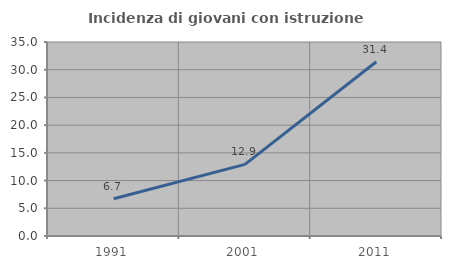
| Category | Incidenza di giovani con istruzione universitaria |
|---|---|
| 1991.0 | 6.725 |
| 2001.0 | 12.925 |
| 2011.0 | 31.435 |